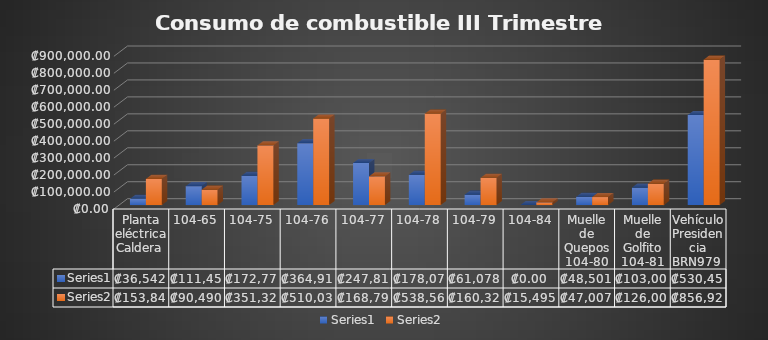
| Category | Series 0 | Series 1 |
|---|---|---|
| Planta eléctrica Caldera  | 36542 | 153846 |
| 104-65 | 111459 | 90490 |
| 104-75 | 172770 | 351320 |
| 104-76 | 364913 | 510030 |
| 104-77 | 247817 | 168797 |
| 104-78 | 178072 | 538568 |
| 104-79 | 61078 | 160323 |
| 104-84 | 0 | 15495 |
| Muelle de Quepos 104-80 | 48501 | 47007 |
| Muelle de Golfito 104-81 | 103000 | 126007 |
| Vehículo Presidencia BRN979  | 530458.16 | 856922 |